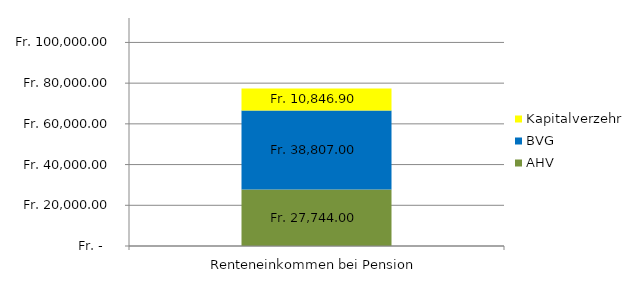
| Category | AHV | BVG | Kapitalverzehr |
|---|---|---|---|
| 0 | 27744 | 38807 | 10846.9 |